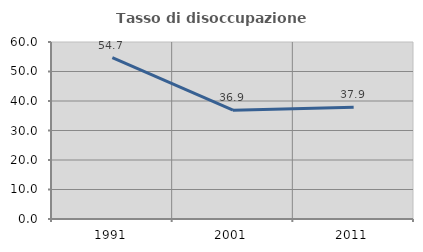
| Category | Tasso di disoccupazione giovanile  |
|---|---|
| 1991.0 | 54.697 |
| 2001.0 | 36.866 |
| 2011.0 | 37.888 |